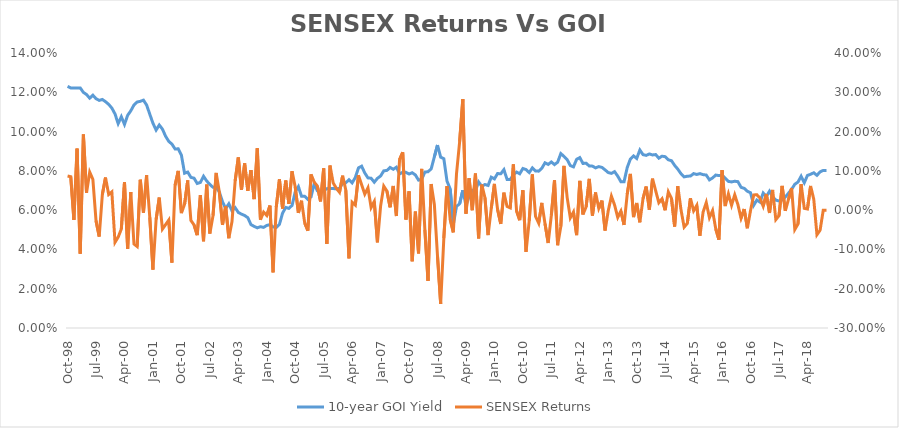
| Category | 10-year GOI Yield |
|---|---|
| Oct-18 | 0.08 |
| Sep-18 | 0.08 |
| Aug-18 | 0.08 |
| Jul-18 | 0.078 |
| Jun-18 | 0.079 |
| May-18 | 0.078 |
| Apr-18 | 0.078 |
| Mar-18 | 0.074 |
| Feb-18 | 0.077 |
| Jan-18 | 0.074 |
| Dec-17 | 0.073 |
| Nov-17 | 0.071 |
| Oct-17 | 0.069 |
| Sep-17 | 0.067 |
| Aug-17 | 0.065 |
| Jul-17 | 0.065 |
| Jun-17 | 0.065 |
| May-17 | 0.067 |
| Apr-17 | 0.07 |
| Mar-17 | 0.067 |
| Feb-17 | 0.069 |
| Jan-17 | 0.064 |
| Dec-16 | 0.065 |
| Nov-16 | 0.062 |
| Oct-16 | 0.069 |
| Sep-16 | 0.07 |
| Aug-16 | 0.071 |
| Jul-16 | 0.072 |
| Jun-16 | 0.074 |
| May-16 | 0.075 |
| Apr-16 | 0.074 |
| Mar-16 | 0.075 |
| Feb-16 | 0.076 |
| Jan-16 | 0.078 |
| Dec-15 | 0.078 |
| Nov-15 | 0.078 |
| Oct-15 | 0.076 |
| Sep-15 | 0.075 |
| Aug-15 | 0.078 |
| Jul-15 | 0.078 |
| Jun-15 | 0.079 |
| May-15 | 0.078 |
| Apr-15 | 0.079 |
| Mar-15 | 0.077 |
| Feb-15 | 0.077 |
| Jan-15 | 0.077 |
| Dec-14 | 0.079 |
| Nov-14 | 0.081 |
| Oct-14 | 0.083 |
| Sep-14 | 0.085 |
| Aug-14 | 0.086 |
| Jul-14 | 0.087 |
| Jun-14 | 0.087 |
| May-14 | 0.086 |
| Apr-14 | 0.088 |
| Mar-14 | 0.088 |
| Feb-14 | 0.089 |
| Jan-14 | 0.088 |
| Dec-13 | 0.088 |
| Nov-13 | 0.091 |
| Oct-13 | 0.086 |
| Sep-13 | 0.088 |
| Aug-13 | 0.086 |
| Jul-13 | 0.082 |
| Jun-13 | 0.074 |
| May-13 | 0.074 |
| Apr-13 | 0.077 |
| Mar-13 | 0.08 |
| Feb-13 | 0.079 |
| Jan-13 | 0.079 |
| Dec-12 | 0.08 |
| Nov-12 | 0.082 |
| Oct-12 | 0.082 |
| Sep-12 | 0.082 |
| Aug-12 | 0.082 |
| Jul-12 | 0.082 |
| Jun-12 | 0.084 |
| May-12 | 0.084 |
| Apr-12 | 0.087 |
| Mar-12 | 0.086 |
| Feb-12 | 0.082 |
| Jan-12 | 0.083 |
| Dec-11 | 0.086 |
| Nov-11 | 0.087 |
| Oct-11 | 0.089 |
| Sep-11 | 0.084 |
| Aug-11 | 0.083 |
| Jul-11 | 0.085 |
| Jun-11 | 0.083 |
| May-11 | 0.084 |
| Apr-11 | 0.081 |
| Mar-11 | 0.08 |
| Feb-11 | 0.08 |
| Jan-11 | 0.081 |
| Dec-10 | 0.079 |
| Nov-10 | 0.081 |
| Oct-10 | 0.081 |
| Sep-10 | 0.079 |
| Aug-10 | 0.079 |
| Jul-10 | 0.078 |
| Jun-10 | 0.076 |
| May-10 | 0.076 |
| Apr-10 | 0.081 |
| Mar-10 | 0.078 |
| Feb-10 | 0.079 |
| Jan-10 | 0.076 |
| Dec-09 | 0.077 |
| Nov-09 | 0.073 |
| Oct-09 | 0.073 |
| Sep-09 | 0.072 |
| Aug-09 | 0.074 |
| Jul-09 | 0.07 |
| Jun-09 | 0.07 |
| May-09 | 0.067 |
| Apr-09 | 0.062 |
| Mar-09 | 0.07 |
| Feb-09 | 0.063 |
| Jan-09 | 0.062 |
| Dec-08 | 0.053 |
| Nov-08 | 0.071 |
| Oct-08 | 0.075 |
| Sep-08 | 0.086 |
| Aug-08 | 0.087 |
| Jul-08 | 0.093 |
| Jun-08 | 0.087 |
| May-08 | 0.081 |
| Apr-08 | 0.08 |
| Mar-08 | 0.079 |
| Feb-08 | 0.076 |
| Jan-08 | 0.075 |
| Dec-07 | 0.078 |
| Nov-07 | 0.079 |
| Oct-07 | 0.078 |
| Sep-07 | 0.079 |
| Aug-07 | 0.079 |
| Jul-07 | 0.078 |
| Jun-07 | 0.082 |
| May-07 | 0.081 |
| Apr-07 | 0.082 |
| Mar-07 | 0.08 |
| Feb-07 | 0.08 |
| Jan-07 | 0.077 |
| Dec-06 | 0.076 |
| Nov-06 | 0.074 |
| Oct-06 | 0.076 |
| Sep-06 | 0.076 |
| Aug-06 | 0.079 |
| Jul-06 | 0.082 |
| Jun-06 | 0.082 |
| May-06 | 0.077 |
| Apr-06 | 0.074 |
| Mar-06 | 0.076 |
| Feb-06 | 0.074 |
| Jan-06 | 0.074 |
| Dec-05 | 0.071 |
| Nov-05 | 0.071 |
| Oct-05 | 0.071 |
| Sep-05 | 0.071 |
| Aug-05 | 0.071 |
| Jul-05 | 0.07 |
| Jun-05 | 0.069 |
| May-05 | 0.07 |
| Apr-05 | 0.074 |
| Mar-05 | 0.067 |
| Feb-05 | 0.065 |
| Jan-05 | 0.067 |
| Dec-04 | 0.067 |
| Nov-04 | 0.072 |
| Oct-04 | 0.069 |
| Sep-04 | 0.062 |
| Aug-04 | 0.061 |
| Jul-04 | 0.061 |
| Jun-04 | 0.058 |
| May-04 | 0.053 |
| Apr-04 | 0.051 |
| Mar-04 | 0.051 |
| Feb-04 | 0.053 |
| Jan-04 | 0.052 |
| Dec-03 | 0.051 |
| Nov-03 | 0.052 |
| Oct-03 | 0.051 |
| Sep-03 | 0.052 |
| Aug-03 | 0.053 |
| Jul-03 | 0.056 |
| Jun-03 | 0.057 |
| May-03 | 0.058 |
| Apr-03 | 0.059 |
| Mar-03 | 0.061 |
| Feb-03 | 0.06 |
| Jan-03 | 0.063 |
| Dec-02 | 0.061 |
| Nov-02 | 0.064 |
| Oct-02 | 0.069 |
| Sep-02 | 0.072 |
| Aug-02 | 0.072 |
| Jul-02 | 0.073 |
| Jun-02 | 0.075 |
| May-02 | 0.077 |
| Apr-02 | 0.074 |
| Mar-02 | 0.074 |
| Feb-02 | 0.076 |
| Jan-02 | 0.077 |
| Dec-01 | 0.079 |
| Nov-01 | 0.079 |
| Oct-01 | 0.088 |
| Sep-01 | 0.091 |
| Aug-01 | 0.091 |
| Jul-01 | 0.094 |
| Jun-01 | 0.095 |
| May-01 | 0.098 |
| Apr-01 | 0.101 |
| Mar-01 | 0.103 |
| Feb-01 | 0.101 |
| Jan-01 | 0.104 |
| Dec-00 | 0.109 |
| Nov-00 | 0.113 |
| Oct-00 | 0.116 |
| Sep-00 | 0.115 |
| Aug-00 | 0.115 |
| Jul-00 | 0.114 |
| Jun-00 | 0.111 |
| May-00 | 0.108 |
| Apr-00 | 0.104 |
| Mar-00 | 0.108 |
| Feb-00 | 0.104 |
| Jan-00 | 0.109 |
| Dec-99 | 0.112 |
| Nov-99 | 0.114 |
| Oct-99 | 0.115 |
| Sep-99 | 0.116 |
| Aug-99 | 0.116 |
| Jul-99 | 0.117 |
| Jun-99 | 0.119 |
| May-99 | 0.117 |
| Apr-99 | 0.119 |
| Mar-99 | 0.12 |
| Feb-99 | 0.122 |
| Jan-99 | 0.122 |
| Dec-98 | 0.122 |
| Nov-98 | 0.122 |
| Oct-98 | 0.123 |